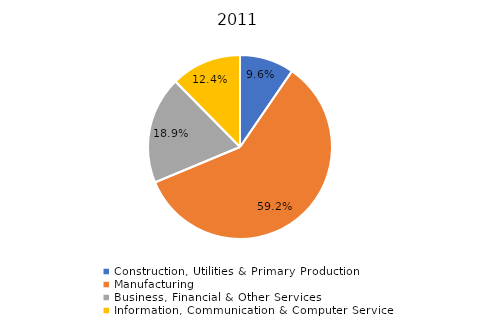
| Category | 2011 |
|---|---|
| Construction, Utilities & Primary Production  | 0.096 |
| Manufacturing  | 0.592 |
| Business, Financial & Other Services | 0.189 |
| Information, Communication & Computer Services | 0.124 |